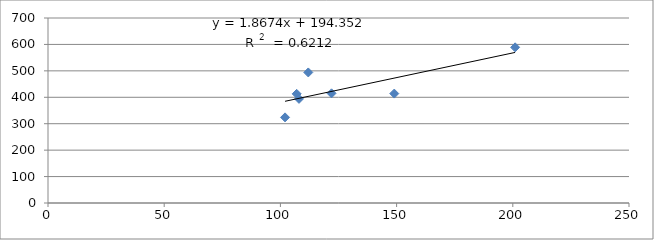
| Category | peso |
|---|---|
| 102.0 | 324 |
| 112.0 | 494 |
| 122.0 | 415 |
| 149.0 | 414 |
| 108.0 | 394 |
| 107.0 | 413 |
| 201.0 | 589 |